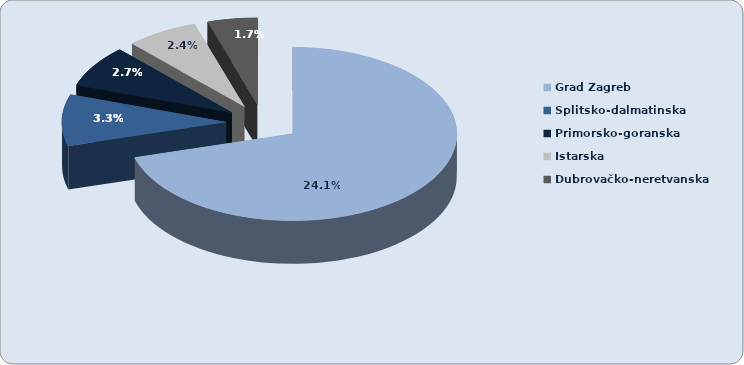
| Category | Series 0 |
|---|---|
| Grad Zagreb | 0.241 |
| Splitsko-dalmatinska | 0.033 |
| Primorsko-goranska | 0.027 |
| Istarska | 0.024 |
| Dubrovačko-neretvanska | 0.017 |